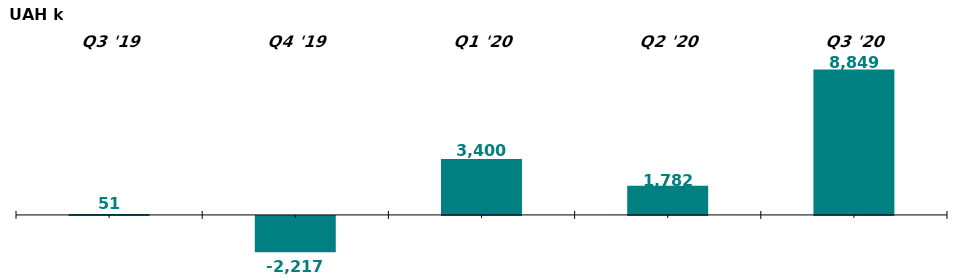
| Category | Net Flow of Capital in Q3 2019-20, UAH k |
|---|---|
| Q3 '19 | 50.954 |
| Q4 '19 | -2216.998 |
| Q1 '20 | 3400.023 |
| Q2 '20 | 1781.633 |
| Q3 '20 | 8849.263 |